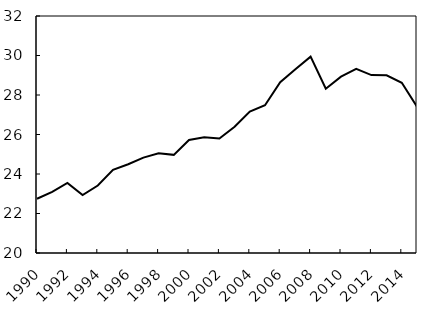
| Category | calculs à partir de la EORA Global Supply Chain Database.  |
|---|---|
| 1990.0 | 22.746 |
| 1991.0 | 23.099 |
| 1992.0 | 23.547 |
| 1993.0 | 22.936 |
| 1994.0 | 23.418 |
| 1995.0 | 24.211 |
| 1996.0 | 24.493 |
| 1997.0 | 24.828 |
| 1998.0 | 25.052 |
| 1999.0 | 24.969 |
| 2000.0 | 25.724 |
| 2001.0 | 25.864 |
| 2002.0 | 25.799 |
| 2003.0 | 26.391 |
| 2004.0 | 27.163 |
| 2005.0 | 27.479 |
| 2006.0 | 28.649 |
| 2007.0 | 29.301 |
| 2008.0 | 29.944 |
| 2009.0 | 28.319 |
| 2010.0 | 28.932 |
| 2011.0 | 29.325 |
| 2012.0 | 29.008 |
| 2013.0 | 29.001 |
| 2014.0 | 28.617 |
| 2015.0 | 27.413 |